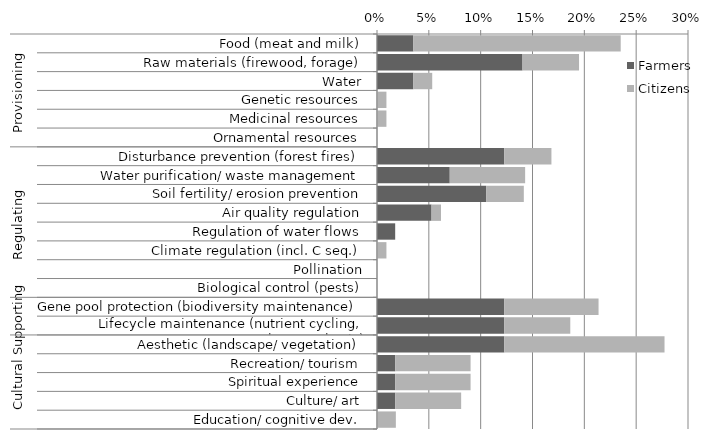
| Category | Farmers | Citizens |
|---|---|---|
| 0 | 0.035 | 0.2 |
| 1 | 0.14 | 0.055 |
| 2 | 0.035 | 0.018 |
| 3 | 0 | 0.009 |
| 4 | 0 | 0.009 |
| 5 | 0 | 0 |
| 6 | 0.123 | 0.045 |
| 7 | 0.07 | 0.073 |
| 8 | 0.105 | 0.036 |
| 9 | 0.053 | 0.009 |
| 10 | 0.018 | 0 |
| 11 | 0 | 0.009 |
| 12 | 0 | 0 |
| 13 | 0 | 0 |
| 14 | 0.123 | 0.091 |
| 15 | 0.123 | 0.064 |
| 16 | 0.123 | 0.155 |
| 17 | 0.018 | 0.073 |
| 18 | 0.018 | 0.073 |
| 19 | 0.018 | 0.064 |
| 20 | 0 | 0.018 |